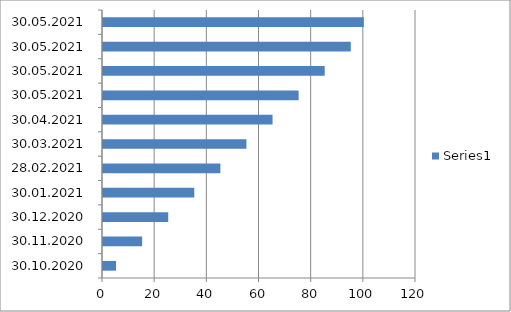
| Category | Series 0 |
|---|---|
| 30.10.2020 | 5 |
| 30.11.2020 | 15 |
| 30.12.2020 | 25 |
| 30.01.2021 | 35 |
| 28.02.2021 | 45 |
| 30.03.2021 | 55 |
| 30.04.2021 | 65 |
| 30.05.2021 | 75 |
| 30.05.2021 | 85 |
| 30.05.2021 | 95 |
| 30.05.2021 | 100 |